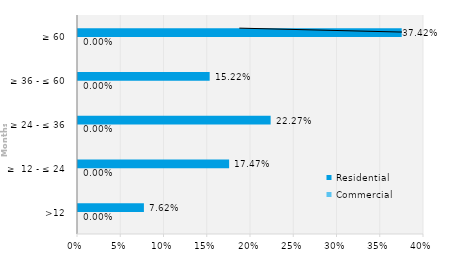
| Category | Commercial | Residential |
|---|---|---|
| >12 | 0 | 0.076 |
| ≥  12 - ≤ 24 | 0 | 0.175 |
| ≥ 24 - ≤ 36 | 0 | 0.223 |
| ≥ 36 - ≤ 60 | 0 | 0.152 |
| ≥ 60 | 0 | 0.374 |